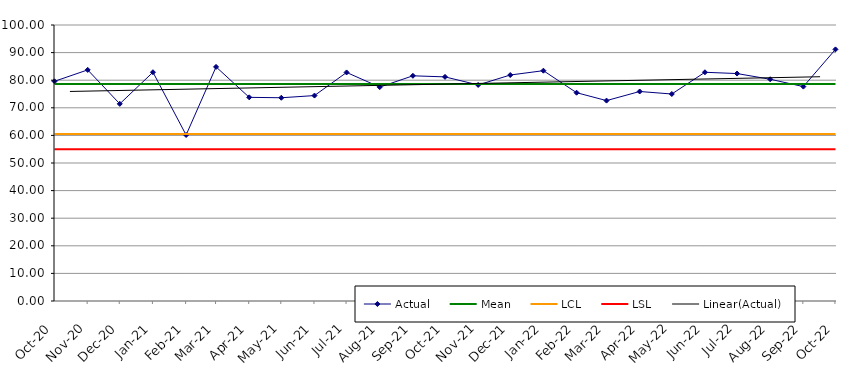
| Category | Actual | Mean | LCL | LSL |
|---|---|---|---|---|
| 2020-10-01 | 79.6 | 78.585 | 60.513 | 55 |
| 2020-11-01 | 83.73 | 78.585 | 60.513 | 55 |
| 2020-12-01 | 71.43 | 78.585 | 60.513 | 55 |
| 2021-01-01 | 82.89 | 78.585 | 60.513 | 55 |
| 2021-02-01 | 60.14 | 78.585 | 60.513 | 55 |
| 2021-03-01 | 84.82 | 78.585 | 60.513 | 55 |
| 2021-04-01 | 73.79 | 78.585 | 60.513 | 55 |
| 2021-05-01 | 73.64 | 78.585 | 60.513 | 55 |
| 2021-06-01 | 74.43 | 78.585 | 60.513 | 55 |
| 2021-07-01 | 82.81 | 78.585 | 60.513 | 55 |
| 2021-08-01 | 77.5 | 78.585 | 60.513 | 55 |
| 2021-09-01 | 81.59 | 78.585 | 60.513 | 55 |
| 2021-10-01 | 81.2 | 78.585 | 60.513 | 55 |
| 2021-11-01 | 78.28 | 78.585 | 60.513 | 55 |
| 2021-12-01 | 81.88 | 78.585 | 60.513 | 55 |
| 2022-01-01 | 83.45 | 78.585 | 60.513 | 55 |
| 2022-02-01 | 75.47 | 78.585 | 60.513 | 55 |
| 2022-03-01 | 72.61 | 78.585 | 60.513 | 55 |
| 2022-04-01 | 75.91 | 78.585 | 60.513 | 55 |
| 2022-05-01 | 75 | 78.585 | 60.513 | 55 |
| 2022-06-01 | 82.87 | 78.585 | 60.513 | 55 |
| 2022-07-01 | 82.41 | 78.585 | 60.513 | 55 |
| 2022-08-01 | 80.34 | 78.585 | 60.513 | 55 |
| 2022-09-01 | 77.68 | 78.585 | 60.513 | 55 |
| 2022-10-01 | 91.16 | 78.585 | 60.513 | 55 |